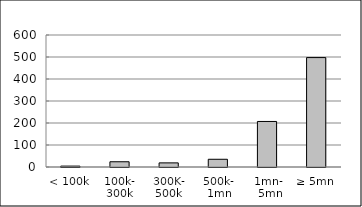
| Category | Series 0 |
|---|---|
| < 100k | 4056984.82 |
| 100k-
300k | 23796585.68 |
| 300K-
500k | 18738087.39 |
| 500k-
1mn | 35134508.46 |
| 1mn-
 5mn | 206997029.51 |
| ≥ 5mn | 497326233.02 |